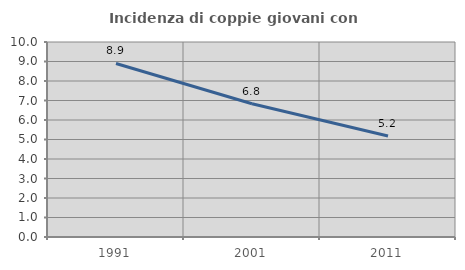
| Category | Incidenza di coppie giovani con figli |
|---|---|
| 1991.0 | 8.901 |
| 2001.0 | 6.83 |
| 2011.0 | 5.176 |